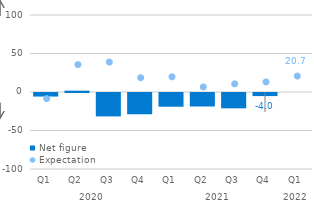
| Category | Net figure |
|---|---|
| 0 | -4.6 |
| 1 | 1.7 |
| 2 | -30.4 |
| 3 | -27.6 |
| 4 | -17.8 |
| 5 | -17.5 |
| 6 | -19.9 |
| 7 | -4 |